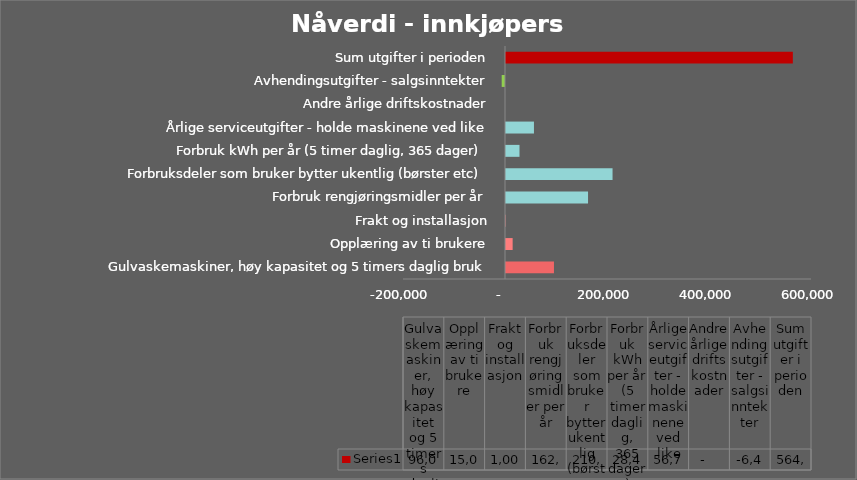
| Category | Series 0 |
|---|---|
| Gulvaskemaskiner, høy kapasitet og 5 timers daglig bruk | 96000 |
| Opplæring av ti brukere | 15000 |
| Frakt og installasjon | 1000 |
| Forbruk rengjøringsmidler per år | 162826.233 |
| Forbruksdeler som bruker bytter ukentlig (børster etc) | 210883.29 |
| Forbruk kWh per år (5 timer daglig, 365 dager) | 28420.579 |
| Årlige serviceutgifter - holde maskinene ved like | 56776.27 |
| Andre årlige driftskostnader | 0 |
| Avhendingsutgifter - salgsinntekter | -6485.416 |
| Sum utgifter i perioden | 564420.956 |